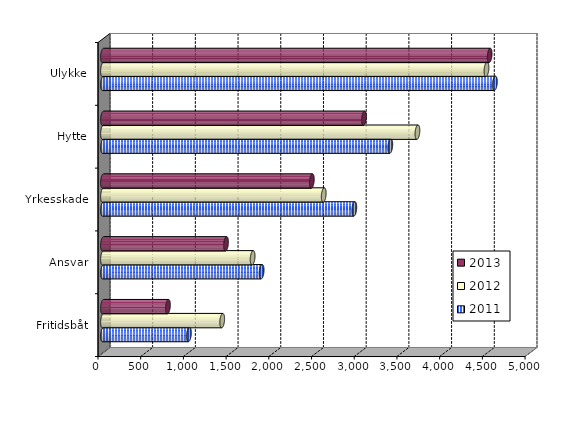
| Category | 2011 | 2012 | 2013 |
|---|---|---|---|
| Fritidsbåt | 1005.855 | 1395.498 | 760.322 |
| Ansvar | 1857.092 | 1751.781 | 1440.347 |
| Yrkesskade | 2942.467 | 2584.187 | 2444.985 |
| Hytte | 3363.669 | 3681.274 | 3055.954 |
| Ulykke | 4588.02 | 4489.746 | 4526.895 |